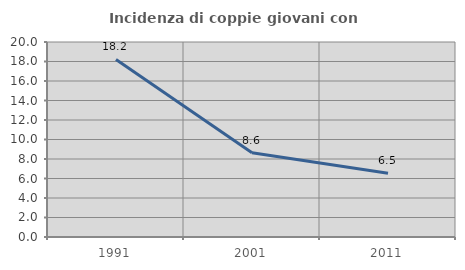
| Category | Incidenza di coppie giovani con figli |
|---|---|
| 1991.0 | 18.209 |
| 2001.0 | 8.646 |
| 2011.0 | 6.527 |